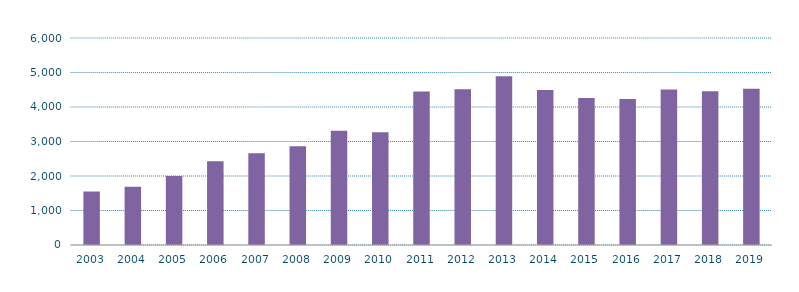
| Category | Nacional |
|---|---|
| 2003.0 | 1547.876 |
| 2004.0 | 1690.876 |
| 2005.0 | 2001.899 |
| 2006.0 | 2430.316 |
| 2007.0 | 2660.078 |
| 2008.0 | 2861.018 |
| 2009.0 | 3309.563 |
| 2010.0 | 3267.591 |
| 2011.0 | 4450.09 |
| 2012.0 | 4510.873 |
| 2013.0 | 4890.025 |
| 2014.0 | 4495.277 |
| 2015.0 | 4258.849 |
| 2016.0 | 4228.952 |
| 2017.0 | 4507.587 |
| 2018.0 | 4455.17 |
| 2019.0 | 4530.555 |